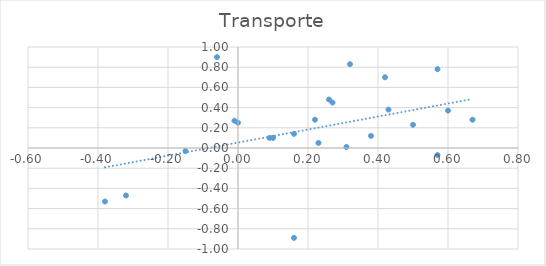
| Category | Transporte |
|---|---|
| 0.38 | 0.12 |
| -0.15 | -0.03 |
| -0.06 | 0.9 |
| 0.32 | 0.83 |
| -0.01 | 0.27 |
| 0.0 | 0.25 |
| -0.38 | -0.53 |
| -0.32 | -0.47 |
| 0.16 | -0.89 |
| 0.57 | -0.07 |
| 0.67 | 0.28 |
| 0.42 | 0.7 |
| 0.26 | 0.48 |
| 0.1 | 0.1 |
| 0.16 | 0.14 |
| 0.23 | 0.05 |
| 0.09 | 0.1 |
| 0.22 | 0.28 |
| 0.27 | 0.45 |
| 0.31 | 0.01 |
| 0.5 | 0.23 |
| 0.43 | 0.38 |
| 0.57 | 0.78 |
| 0.6 | 0.37 |